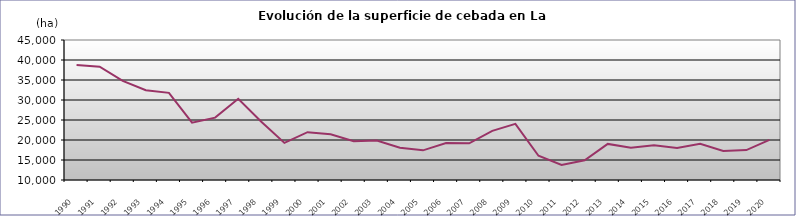
| Category | TOTAL |
|---|---|
| 1990.0 | 38740 |
| 1991.0 | 38329 |
| 1992.0 | 34758 |
| 1993.0 | 32427 |
| 1994.0 | 31789 |
| 1995.0 | 24344 |
| 1996.0 | 25593 |
| 1997.0 | 30304 |
| 1998.0 | 24543 |
| 1999.0 | 19282 |
| 2000.0 | 21947 |
| 2001.0 | 21418 |
| 2002.0 | 19718 |
| 2003.0 | 19883 |
| 2004.0 | 18057 |
| 2005.0 | 17415 |
| 2006.0 | 19231 |
| 2007.0 | 19172 |
| 2008.0 | 22283 |
| 2009.0 | 24046 |
| 2010.0 | 16055 |
| 2011.0 | 13762 |
| 2012.0 | 14923 |
| 2013.0 | 19023 |
| 2014.0 | 18058 |
| 2015.0 | 18677 |
| 2016.0 | 17981 |
| 2017.0 | 19033 |
| 2018.0 | 17268 |
| 2019.0 | 17490 |
| 2020.0 | 20042 |